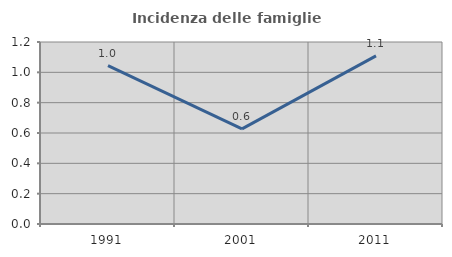
| Category | Incidenza delle famiglie numerose |
|---|---|
| 1991.0 | 1.045 |
| 2001.0 | 0.627 |
| 2011.0 | 1.109 |